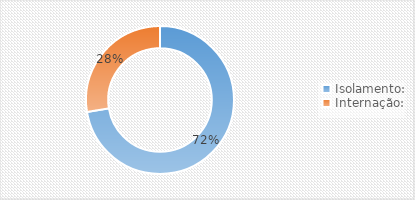
| Category | Series 0 |
|---|---|
| Isolamento: | 21 |
| Internação: | 8 |